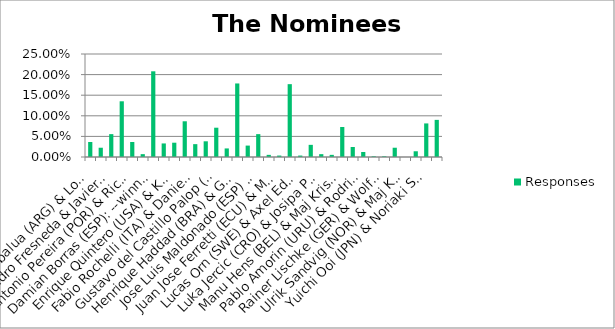
| Category | Responses |
|---|---|
| Agustin Zabalua (ARG) & Louis Moysan (ESP)--winners of the Copa de Espana | 0.036 |
| Alan Williams (GBR) & Liz Pike (GBR)--winners of the UK Nationals | 0.022 |
| Alejandro Fresneda & Javier Lopez (ESP)--winners of the Master European Championship | 0.056 |
| Alexandre Paradeda (BRA)--number 1 skipper on the SSL Snipe International Ranking, winners with Gabiel Kieling of the Brazilian Nationals and second at the Snipe Worlds | 0.135 |
| Antonio Pereira (POR) & Ricardo Schedel (POR)--winners of the Portuguese Nationals | 0.036 |
| Christian Andersen (DEN) & Laerke Norgaard--winners of the Danish Nationals | 0.007 |
| Damian Borras (ESP): --winner with Sara Franceschi (ESP) of the Trofeo Armada Espanola, with Alexandra Wang (NOR) of the Norwegian Nationals and third with Jordi Triay (ESP) at the Snipe Worlds | 0.208 |
| Dario Bruni (ITA) & Emanuele Zampieri (ITA)--winners of the Italian Nationals | 0.033 |
| Enrique Quintero (USA) & Kathleen Tocke (USA)--winners of the North Americans | 0.035 |
| Ernesto Rodriguez (USA) & Hallie Schiffman (USA)--gold medalists at the Pan American Games and winners of the Don Q | 0.087 |
| Fabio Rochelli (ITA) & Daniela Semec (ITA)--winners of the Open Croatian National | 0.031 |
| Gustavo Abdulklech (BRA) & Leonardo Motta (BRA)--winners of the Junior Worlds | 0.038 |
| Gustavo del Castillo Palop (ESP) & Rafael del Castillo Palop (ESP)--winners of the Spanish Nationals | 0.071 |
| Harri Palm (CAN) & Inessa Townsend-Fish (CAN)--winners of the Canadian Nationals | 0.021 |
| Henrique Haddad (BRA) & Gustavo Nascimento (BRA)--winners of the 2019 Snipe World Championship | 0.178 |
| Jean Jacques Frebault (FRA) & Kevin Roze (FRA)--winners of the French Nationals | 0.028 |
| Jose Luis Maldonado (ESP) & Alexandre Tinoco (BRA)--winners of the German Open | 0.056 |
| Jostein Grodem (NOR) & Karen Kristoffersen (NOR)--winners of the Norwegian Nationals | 0.005 |
| Juan Jose Ferretti (ECU) & Maria Emilia Moreno (ECU)--winners of the Ecuadorian Nationals | 0.004 |
| Kathleen Tocke (USA)--number 1 crew on the SSL Snipe International Ranking, winner with skipper Gintare Scheidt (LTU) of the Women's Europeans, with Mateus Tavares (BRA) of the Bibi Juetz Trophy for the best mixed team at the Senior Worlds, with Tomas Horn | 0.177 |
| Lucas Orn (SWE) & Axel Edwall (SWE)--winners of the Swedish Nationals | 0.004 |
| Luis Soubie (ARG) & Diego Lipszyc (ARG)--winners of the Argentinian Nationals | 0.03 |
| Luka Jercic (CRO) & Josipa Prosinecki (CRO)--winners of the Croatian Nationals | 0.007 |
| Lukasz Sokolowski (POL) & Piotr Sokolowski (POL)--winners of the Polish Nationals | 0.005 |
| Manu Hens (BEL) & Maj Kristin Hansen Borgen (NOR)--winners of the Belgian Nationals and of the Open Italian Nationals | 0.073 |
| Matias Seguel (CHI) & Maria Jesus Segiel (CHI)--winners of the South Americans and of the Chilean Nationals | 0.024 |
| Pablo Amorin (URU) & Rodrigo Rossi (URU)--winners of the Uruguayan Nationals | 0.012 |
| Pedro Vega (PER) & Lisset Castillo (PER)--winners of the Peruvian Nationals | 0.002 |
| Rainer Lischke (GER) & Wolfram Muhlhuber (GER)--winners of the German Nationals | 0.002 |
| Ricardo Fabini (URU) & Florencia Parnizari (URU)--winners of South Europeanss | 0.022 |
| Ulrik Sandvig (NOR) & Maj Kristin Hansen Borgen (NOR)--winners of the Open Swedish Nationals | 0 |
| Ville Aalto-Setala (FIN) & Satu Salminen (FIN)--winners of the Finnish Nationals | 0.014 |
| Yuichi Ooi (JPN) & Noriaki Sakai (JPN)--winners of the Japanese Nationals | 0.082 |
| Write in your nominee: | 0.09 |